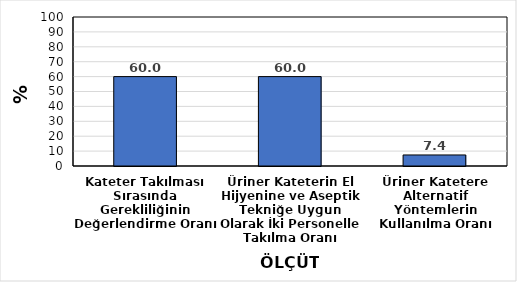
| Category | % |
|---|---|
| Kateter Takılması Sırasında Gerekliliğinin Değerlendirme Oranı | 60 |
| Üriner Kateterin El Hijyenine ve Aseptik Tekniğe Uygun Olarak İki Personelle Takılma Oranı | 60 |
| Üriner Katetere Alternatif Yöntemlerin Kullanılma Oranı | 7.407 |